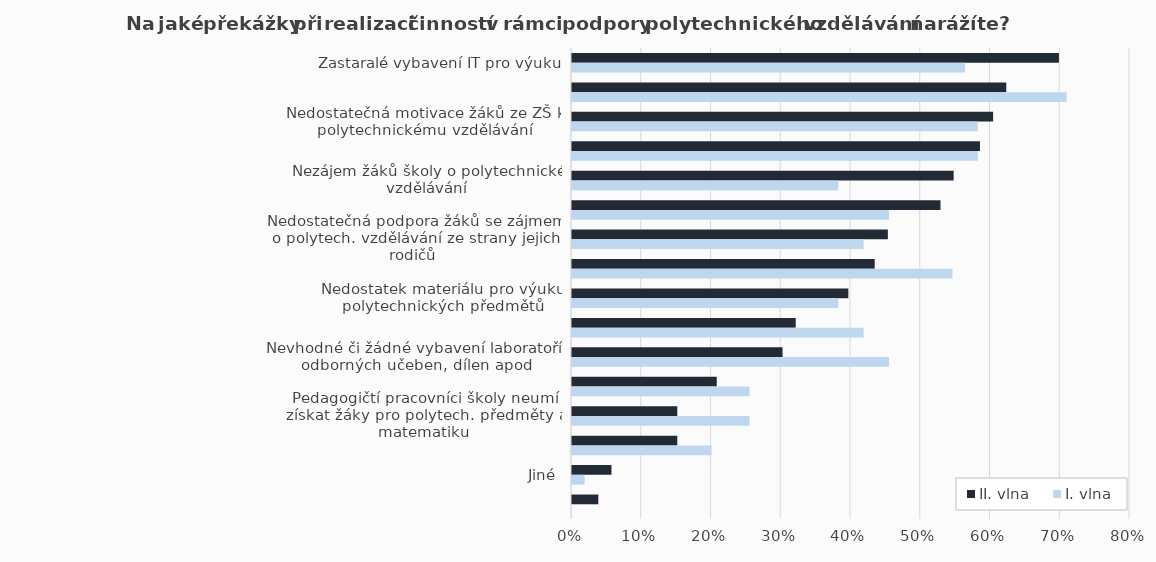
| Category | II. vlna | I. vlna |
|---|---|---|
| Zastaralé vybavení IT pro výuku | 0.698 | 0.564 |
| Nedostatek financí na úhradu vedení nepovinných předmětů | 0.623 | 0.709 |
| Nedostatečná motivace žáků ze ZŠ k polytechnickému vzdělávání | 0.604 | 0.582 |
| Nedostatečné znalosti žáků ze ZŠ v oblasti polytechnického vzdělávání | 0.585 | 0.582 |
| Nezájem žáků školy o polytechnické vzdělávání | 0.547 | 0.382 |
| Učitelé polytech. předmětů nejsou jazykově vybaveni pro výuku v cizích jazycích | 0.528 | 0.455 |
| Nedostatečná podpora žáků se zájmem o polytech. vzdělávání ze strany jejich rodičů | 0.453 | 0.418 |
| Nedostatečné/neodpovídající prostory | 0.434 | 0.545 |
| Nedostatek materiálu pro výuku polytechnických předmětů | 0.396 | 0.382 |
| Malá podpora ze strany zaměstnavatelů | 0.321 | 0.418 |
| Nevhodné či žádné vybavení laboratoří, odborných učeben, dílen apod | 0.302 | 0.455 |
| Nedostatečná podpora víceoborových tříd příbuzných oborů | 0.208 | 0.255 |
| Pedagogičtí pracovníci školy neumí získat žáky pro polytech. předměty a matematiku | 0.151 | 0.255 |
| Pedagogičtí pracovníci nemají aktuální znalosti a dovednosti v polytechnické oblasti | 0.151 | 0.2 |
| Jiné | 0.057 | 0.018 |
| V této oblasti nenarážíme na žádné překážky | 0.038 | 0 |